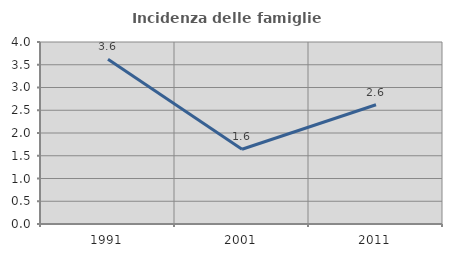
| Category | Incidenza delle famiglie numerose |
|---|---|
| 1991.0 | 3.621 |
| 2001.0 | 1.643 |
| 2011.0 | 2.62 |